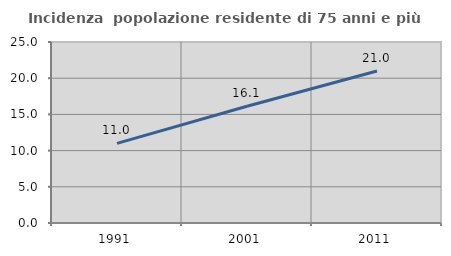
| Category | Incidenza  popolazione residente di 75 anni e più |
|---|---|
| 1991.0 | 10.995 |
| 2001.0 | 16.129 |
| 2011.0 | 20.988 |